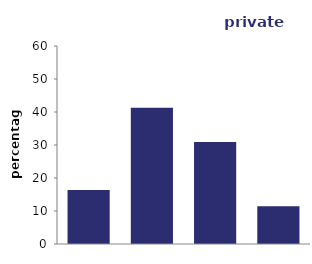
| Category | private rented |
|---|---|
| one | 16.399 |
| two | 41.268 |
| three | 30.89 |
| four or 
over | 11.443 |